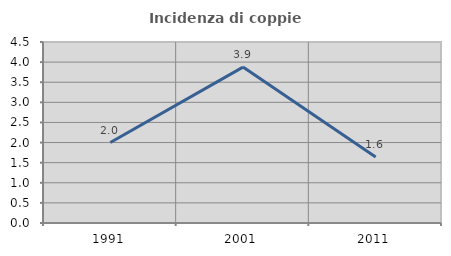
| Category | Incidenza di coppie miste |
|---|---|
| 1991.0 | 2 |
| 2001.0 | 3.876 |
| 2011.0 | 1.639 |